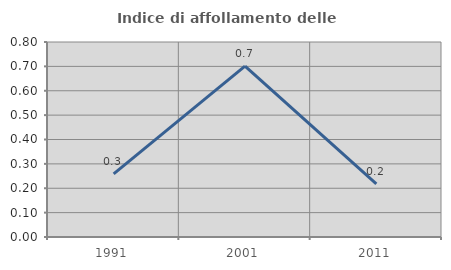
| Category | Indice di affollamento delle abitazioni  |
|---|---|
| 1991.0 | 0.259 |
| 2001.0 | 0.701 |
| 2011.0 | 0.218 |